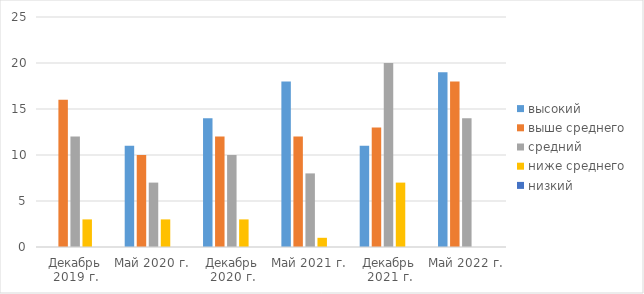
| Category | высокий | выше среднего | средний | ниже среднего | низкий |
|---|---|---|---|---|---|
| Декабрь 2019 г. | 0 | 16 | 12 | 3 | 0 |
| Май 2020 г. | 11 | 10 | 7 | 3 | 0 |
| Декабрь 2020 г. | 14 | 12 | 10 | 3 | 0 |
| Май 2021 г. | 18 | 12 | 8 | 1 | 0 |
| Декабрь 2021 г. | 11 | 13 | 20 | 7 | 0 |
| Май 2022 г. | 19 | 18 | 14 | 0 | 0 |